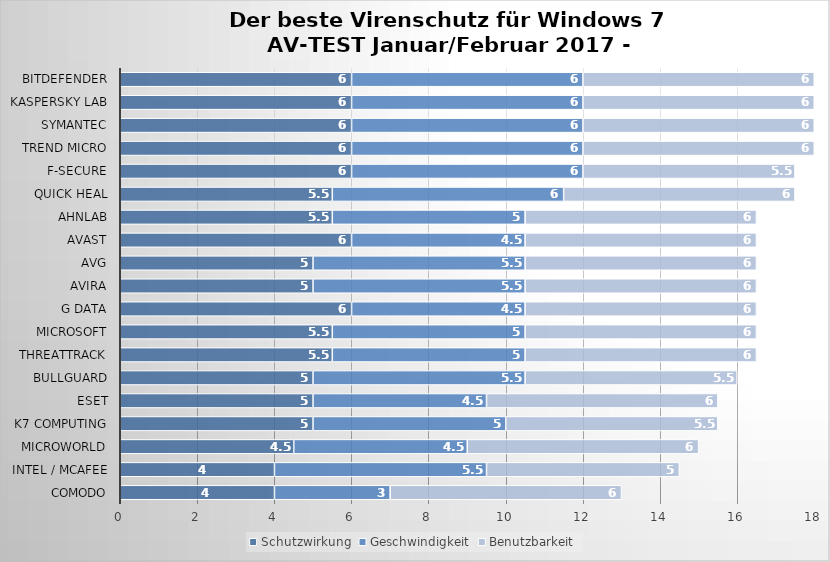
| Category | Schutzwirkung | Geschwindigkeit | Benutzbarkeit |
|---|---|---|---|
| Comodo | 4 | 3 | 6 |
| Intel / McAfee | 4 | 5.5 | 5 |
| Microworld | 4.5 | 4.5 | 6 |
| K7 Computing | 5 | 5 | 5.5 |
| ESET | 5 | 4.5 | 6 |
| BullGuard | 5 | 5.5 | 5.5 |
| ThreatTrack | 5.5 | 5 | 6 |
| Microsoft | 5.5 | 5 | 6 |
| G Data | 6 | 4.5 | 6 |
| Avira | 5 | 5.5 | 6 |
| AVG | 5 | 5.5 | 6 |
| Avast | 6 | 4.5 | 6 |
| AhnLab | 5.5 | 5 | 6 |
| Quick Heal | 5.5 | 6 | 6 |
| F-Secure | 6 | 6 | 5.5 |
| Trend Micro | 6 | 6 | 6 |
| Symantec | 6 | 6 | 6 |
| Kaspersky Lab | 6 | 6 | 6 |
| Bitdefender | 6 | 6 | 6 |